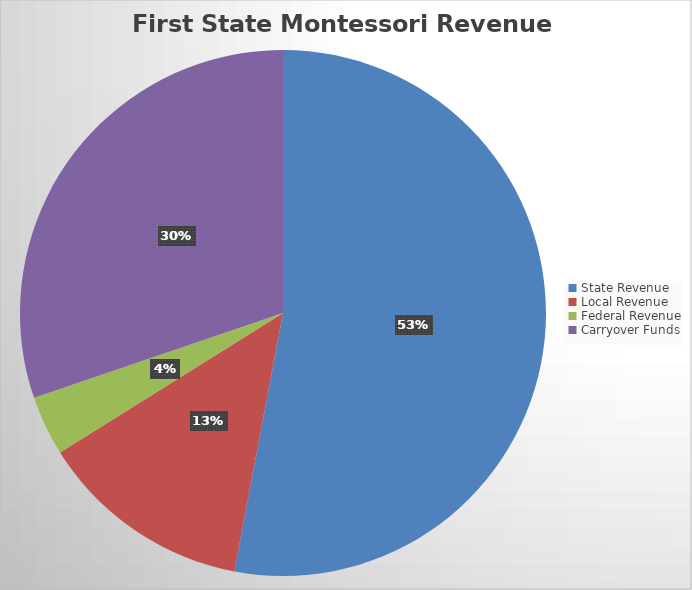
| Category | Series 0 |
|---|---|
| State Revenue | 4297566 |
| Local Revenue | 1065220.06 |
| Federal Revenue | 298826 |
| Carryover Funds | 2452130.34 |